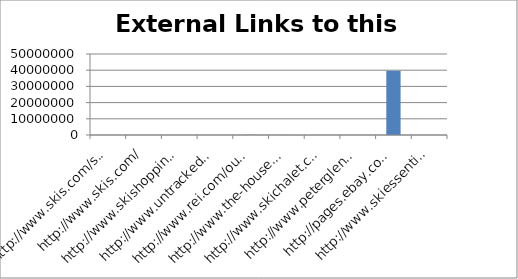
| Category | External Links to this domain |
|---|---|
| http://www.skis.com/ski-equipment/c9/ | 6749 |
| http://www.skis.com/ | 6749 |
| http://www.skishoppingguide.com/ | 522 |
| http://www.untracked.com/ | 250 |
| http://www.rei.com/outlet/category/22000078 | 116417 |
| http://www.the-house.com/skis.html | 33453 |
| http://www.skichalet.com/ | 198 |
| http://www.peterglenn.com/ | 1668 |
| http://pages.ebay.com/buy/guides/skis-skiing-equipment-buying-guide/ | 39635372 |
| http://www.skiessentials.com/ | 275 |